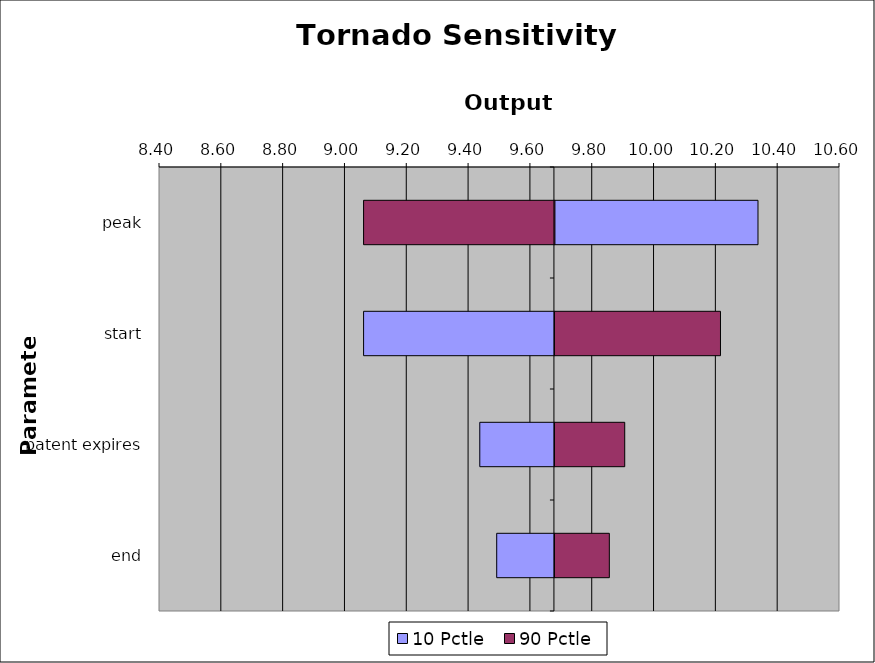
| Category | 10 Pctle | 90 Pctle |
|---|---|---|
| peak | 10.335 | 9.06 |
| start | 9.06 | 10.213 |
| patent expires | 9.436 | 9.904 |
| end | 9.491 | 9.854 |